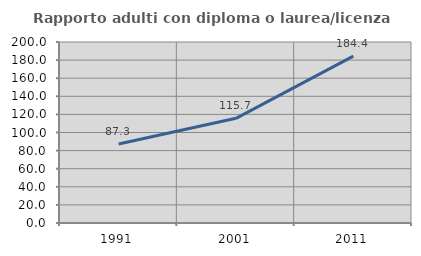
| Category | Rapporto adulti con diploma o laurea/licenza media  |
|---|---|
| 1991.0 | 87.304 |
| 2001.0 | 115.664 |
| 2011.0 | 184.385 |